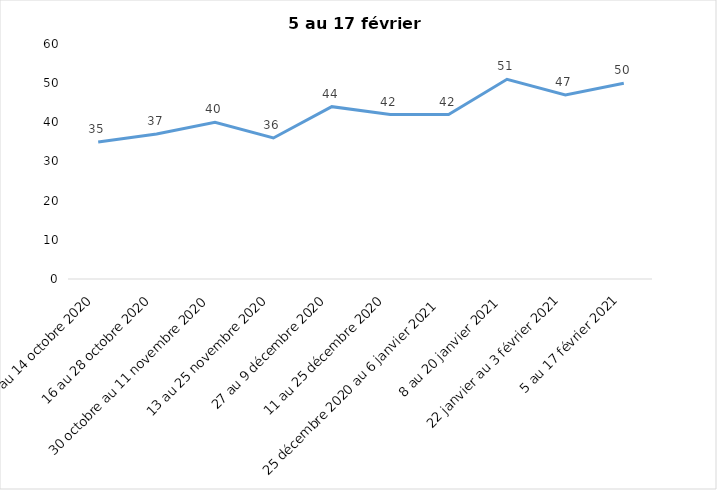
| Category | Toujours aux trois mesures |
|---|---|
| 2 au 14 octobre 2020 | 35 |
| 16 au 28 octobre 2020 | 37 |
| 30 octobre au 11 novembre 2020 | 40 |
| 13 au 25 novembre 2020 | 36 |
| 27 au 9 décembre 2020 | 44 |
| 11 au 25 décembre 2020 | 42 |
| 25 décembre 2020 au 6 janvier 2021 | 42 |
| 8 au 20 janvier 2021 | 51 |
| 22 janvier au 3 février 2021 | 47 |
| 5 au 17 février 2021 | 50 |